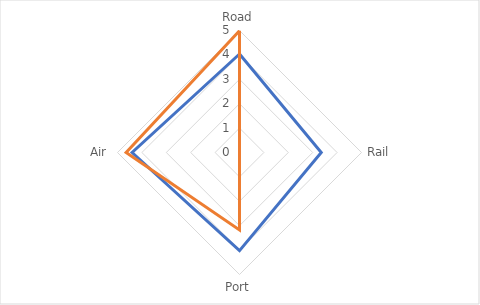
| Category | Global Average | Rwanda |
|---|---|---|
| Road | 4.037 | 4.99 |
| Rail | 3.351 | 0 |
| Port | 4.022 | 3.177 |
| Air | 4.401 | 4.647 |